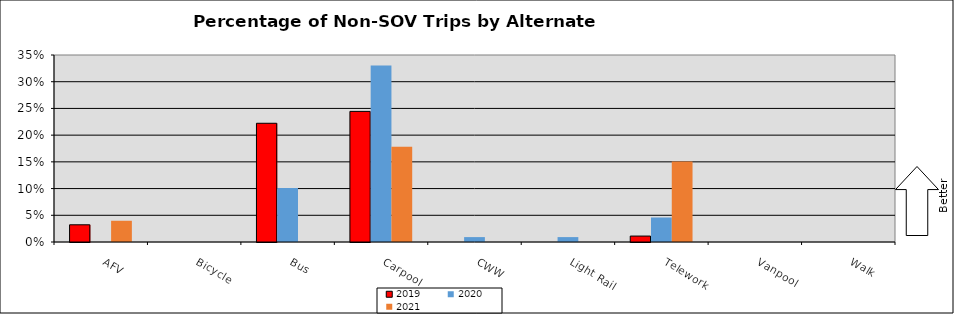
| Category | 2019 | 2020 | 2021 |
|---|---|---|---|
| AFV | 0.032 | 0 | 0.04 |
| Bicycle | 0 | 0 | 0 |
| Bus | 0.222 | 0.101 | 0 |
| Carpool | 0.244 | 0.33 | 0.178 |
| CWW | 0 | 0.009 | 0 |
| Light Rail | 0 | 0.009 | 0 |
| Telework | 0.011 | 0.046 | 0.151 |
| Vanpool | 0 | 0 | 0 |
| Walk | 0 | 0 | 0 |